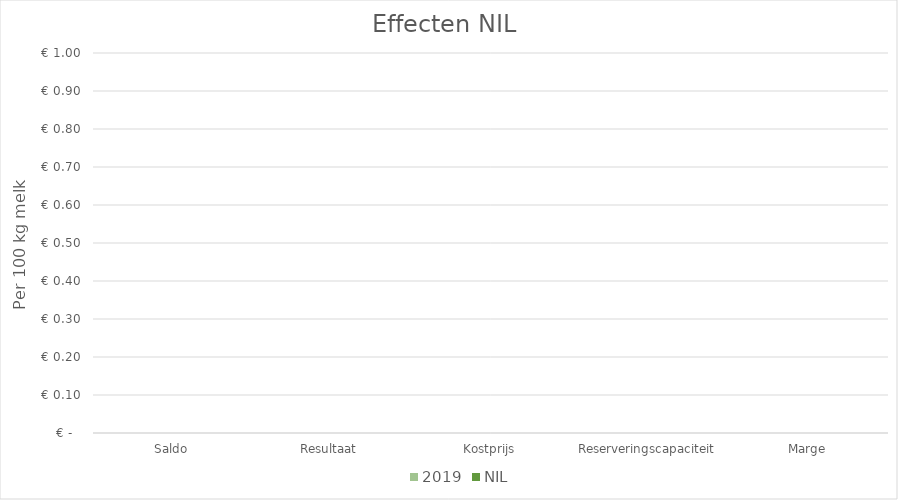
| Category | 2019 | NIL |
|---|---|---|
| Saldo | 0 | 0 |
| Resultaat | 0 | 0 |
| Kostprijs | 0 | 0 |
| Reserveringscapaciteit | 0 | 0 |
| Marge | 0 | 0 |